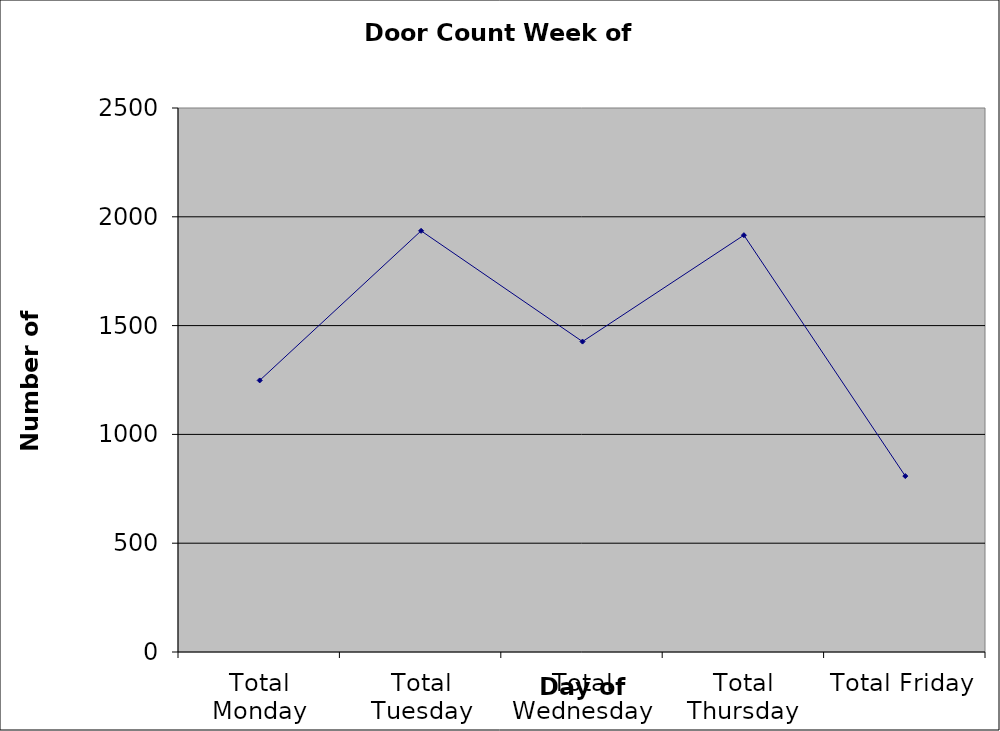
| Category | Series 0 |
|---|---|
| Total Monday | 1248 |
| Total Tuesday | 1935.5 |
| Total Wednesday | 1426.5 |
| Total Thursday | 1915.5 |
| Total Friday | 808.5 |